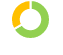
| Category | Series 0 |
|---|---|
| 0 | 2 |
| 1 | 1 |
| 2 | 0 |